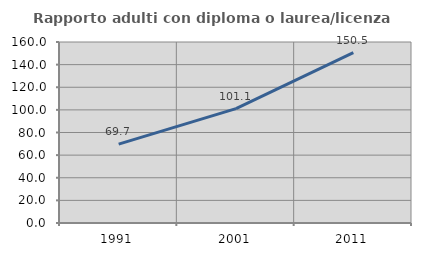
| Category | Rapporto adulti con diploma o laurea/licenza media  |
|---|---|
| 1991.0 | 69.74 |
| 2001.0 | 101.075 |
| 2011.0 | 150.545 |